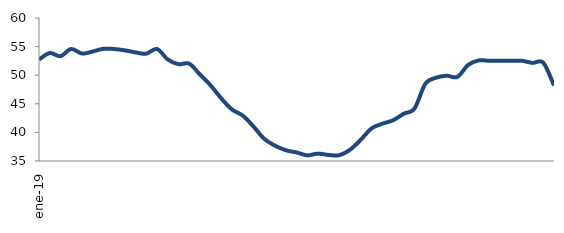
| Category | Series 0 |
|---|---|
| 2019-01-01 | 52.723 |
| 2019-02-01 | 53.876 |
| 2019-03-01 | 53.327 |
| 2019-04-01 | 54.589 |
| 2019-05-01 | 53.785 |
| 2019-06-01 | 54.141 |
| 2019-07-01 | 54.62 |
| 2019-08-01 | 54.58 |
| 2019-09-01 | 54.344 |
| 2019-10-01 | 53.985 |
| 2019-11-01 | 53.756 |
| 2019-12-01 | 54.579 |
| 2020-01-01 | 52.748 |
| 2020-02-01 | 51.924 |
| 2020-03-01 | 52.017 |
| 2020-04-01 | 50.123 |
| 2020-05-01 | 48.215 |
| 2020-06-01 | 45.912 |
| 2020-07-01 | 43.989 |
| 2020-08-01 | 42.923 |
| 2020-09-01 | 41.015 |
| 2020-10-01 | 38.867 |
| 2020-11-01 | 37.678 |
| 2020-12-01 | 36.885 |
| 2021-01-01 | 36.497 |
| 2021-02-01 | 35.988 |
| 2021-03-01 | 36.29 |
| 2021-04-01 | 36.047 |
| 2021-05-01 | 36.023 |
| 2021-06-01 | 36.982 |
| 2021-07-01 | 38.733 |
| 2021-08-01 | 40.7 |
| 2021-09-01 | 41.525 |
| 2021-10-01 | 42.118 |
| 2021-11-01 | 43.262 |
| 2021-12-01 | 44.177 |
| 2022-01-01 | 48.481 |
| 2022-02-01 | 49.558 |
| 2022-03-01 | 49.904 |
| 2022-04-01 | 49.706 |
| 2022-05-01 | 51.792 |
| 2022-06-01 | 52.589 |
| 2022-07-01 | 52.508 |
| 2022-08-01 | 52.513 |
| 2022-09-01 | 52.513 |
| 2022-10-01 | 52.526 |
| 2022-11-01 | 52.149 |
| 2022-12-01 | 52.184 |
| 2023-01-01 | 48.201 |